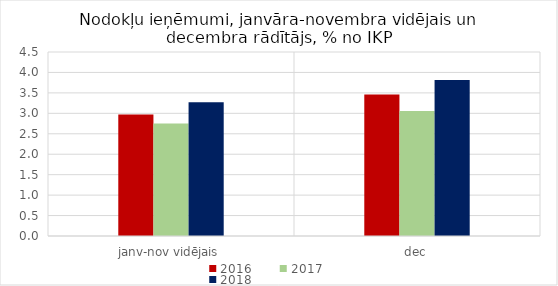
| Category | 2016 | 2017 | 2018 |
|---|---|---|---|
| janv-nov vidējais | 2.974 | 2.751 | 3.271 |
| dec | 3.458 | 3.057 | 3.813 |